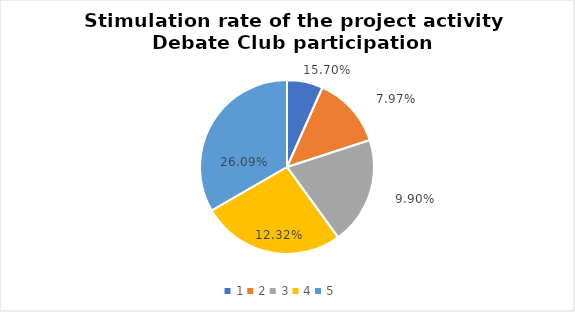
| Category | Series 0 | Series 1 |
|---|---|---|
| 0 | 1 | 0.157 |
| 1 | 2 | 0.08 |
| 2 | 3 | 0.099 |
| 3 | 4 | 0.123 |
| 4 | 5 | 0.261 |